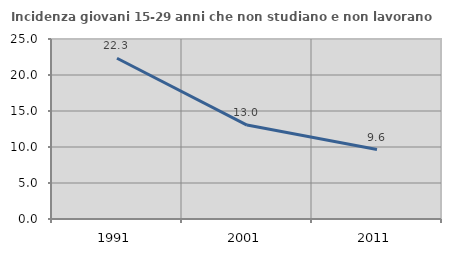
| Category | Incidenza giovani 15-29 anni che non studiano e non lavorano  |
|---|---|
| 1991.0 | 22.323 |
| 2001.0 | 13.043 |
| 2011.0 | 9.649 |